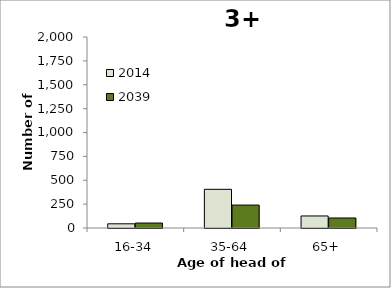
| Category | 2014 | 2039 |
|---|---|---|
| 16-34 | 44 | 52 |
| 35-64 | 405 | 240 |
| 65+ | 126 | 105 |